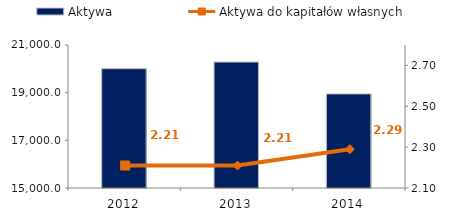
| Category | Aktywa |
|---|---|
| 2012.0 | 20005 |
| 2013.0 | 20284.8 |
| 2014.0 | 18947.3 |